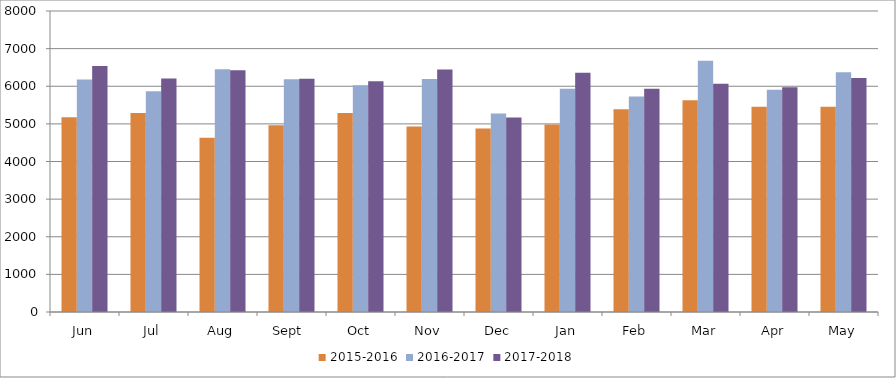
| Category | 2015-2016 | 2016-2017 | 2017-2018 |
|---|---|---|---|
| Jun | 5174 | 6180 | 6540 |
| Jul | 5289 | 5868 | 6208 |
| Aug | 4628 | 6455 | 6428 |
| Sept  | 4965 | 6189 | 6197 |
| Oct | 5291 | 6026 | 6130 |
| Nov | 4928 | 6191 | 6447 |
| Dec | 4874 | 5278 | 5170 |
| Jan | 4982 | 5934 | 6362 |
| Feb | 5386 | 5725 | 5933 |
| Mar | 5630 | 6677 | 6066 |
| Apr | 5454 | 5908 | 5971 |
| May | 5453 | 6371 | 6217 |